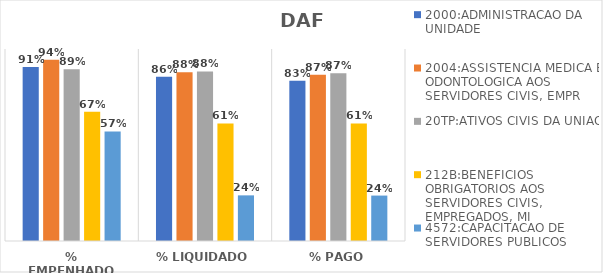
| Category | 2000:ADMINISTRACAO DA UNIDADE | 2004:ASSISTENCIA MEDICA E ODONTOLOGICA AOS SERVIDORES CIVIS, EMPR | 20TP:ATIVOS CIVIS DA UNIAO | 212B:BENEFICIOS OBRIGATORIOS AOS SERVIDORES CIVIS, EMPREGADOS, MI | 4572:CAPACITACAO DE SERVIDORES PUBLICOS FEDERAIS EM PROCESSO DE Q |
|---|---|---|---|---|---|
| % EMPENHADO | 0.906 | 0.945 | 0.895 | 0.673 | 0.57 |
| % LIQUIDADO | 0.856 | 0.879 | 0.883 | 0.612 | 0.238 |
| % PAGO | 0.834 | 0.865 | 0.873 | 0.612 | 0.237 |